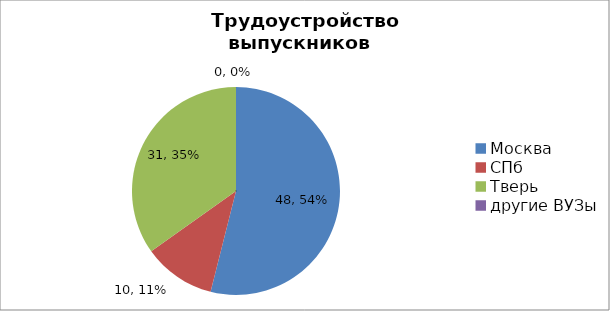
| Category | 2016 г. |
|---|---|
| Москва | 48 |
| СПб | 10 |
| Тверь | 31 |
| другие ВУЗы | 0 |